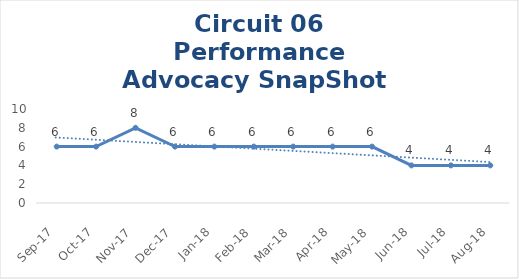
| Category | Circuit 06 |
|---|---|
| Sep-17 | 6 |
| Oct-17 | 6 |
| Nov-17 | 8 |
| Dec-17 | 6 |
| Jan-18 | 6 |
| Feb-18 | 6 |
| Mar-18 | 6 |
| Apr-18 | 6 |
| May-18 | 6 |
| Jun-18 | 4 |
| Jul-18 | 4 |
| Aug-18 | 4 |